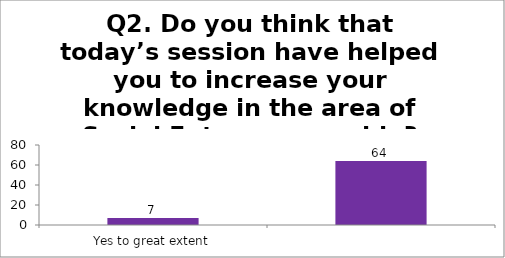
| Category | Q2. Do you think that today’s session have helped you to increase your knowledge in the area of Social Entrepreneurship? |
|---|---|
| Yes to great extent | 7 |